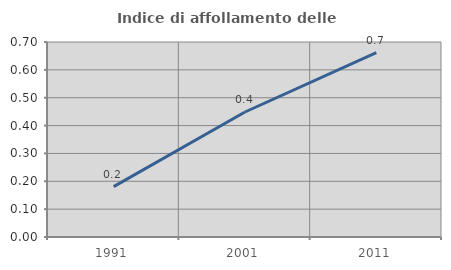
| Category | Indice di affollamento delle abitazioni  |
|---|---|
| 1991.0 | 0.181 |
| 2001.0 | 0.449 |
| 2011.0 | 0.662 |